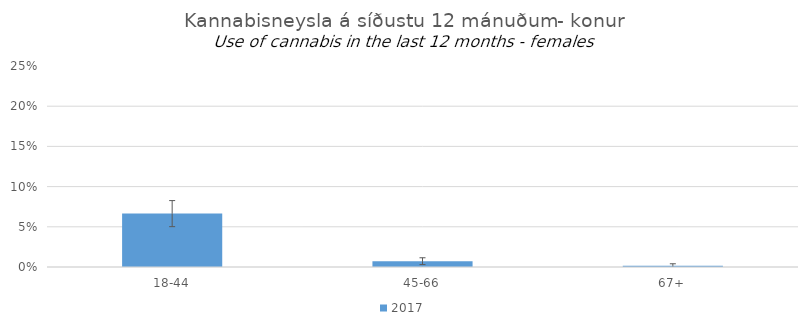
| Category | 2017 |
|---|---|
| 18-44 | 0.066 |
| 45-66 | 0.007 |
| 67+ | 0.002 |